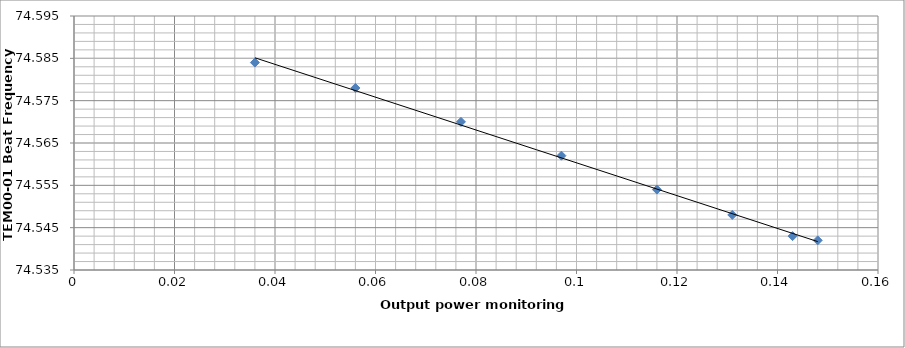
| Category | Series 0 |
|---|---|
| 0.148 | 74.542 |
| 0.143 | 74.543 |
| 0.131 | 74.548 |
| 0.116 | 74.554 |
| 0.097 | 74.562 |
| 0.077 | 74.57 |
| 0.056 | 74.578 |
| 0.036 | 74.584 |